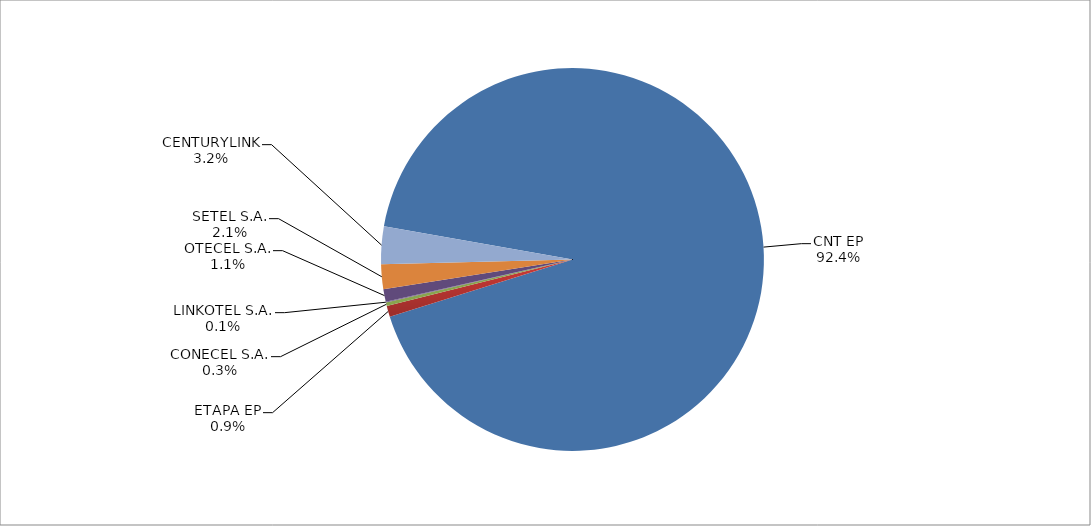
| Category | Series 0 |
|---|---|
| CNT EP | 2862 |
| ETAPA EP | 29 |
| CONECEL S.A. | 9 |
| LINKOTEL S.A. | 2 |
| OTECEL S.A. | 33 |
| SETEL S.A. | 65 |
| CENTURYLINK | 98 |